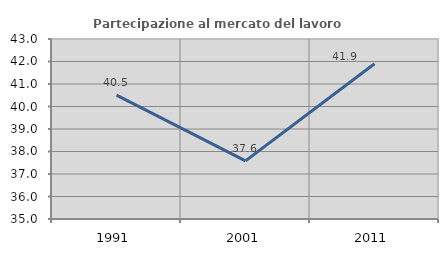
| Category | Partecipazione al mercato del lavoro  femminile |
|---|---|
| 1991.0 | 40.506 |
| 2001.0 | 37.584 |
| 2011.0 | 41.899 |